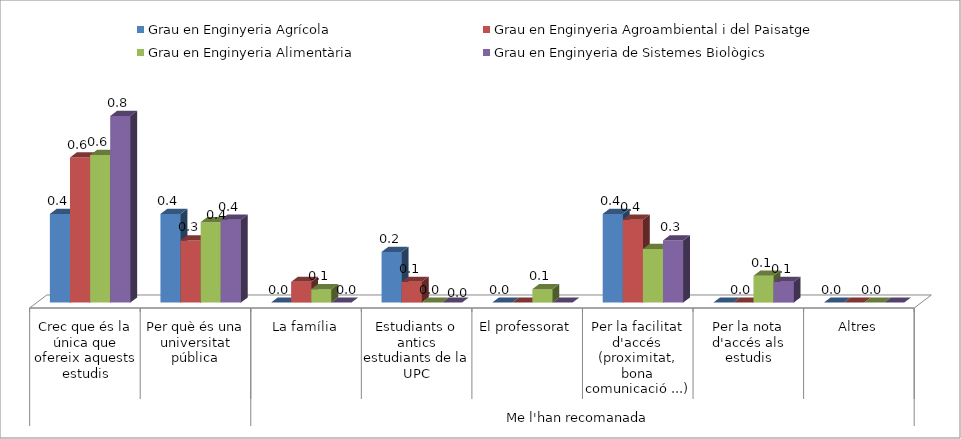
| Category | Grau en Enginyeria Agrícola | Grau en Enginyeria Agroambiental i del Paisatge | Grau en Enginyeria Alimentària | Grau en Enginyeria de Sistemes Biològics |
|---|---|---|---|---|
| 0 | 0.389 | 0.636 | 0.647 | 0.818 |
| 1 | 0.389 | 0.273 | 0.353 | 0.364 |
| 2 | 0 | 0.091 | 0.059 | 0 |
| 3 | 0.222 | 0.091 | 0 | 0 |
| 4 | 0 | 0 | 0.059 | 0 |
| 5 | 0.389 | 0.364 | 0.235 | 0.273 |
| 6 | 0 | 0 | 0.118 | 0.091 |
| 7 | 0 | 0 | 0 | 0 |